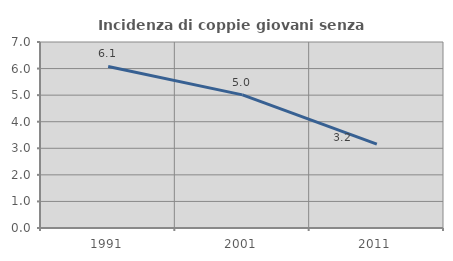
| Category | Incidenza di coppie giovani senza figli |
|---|---|
| 1991.0 | 6.081 |
| 2001.0 | 5.01 |
| 2011.0 | 3.158 |